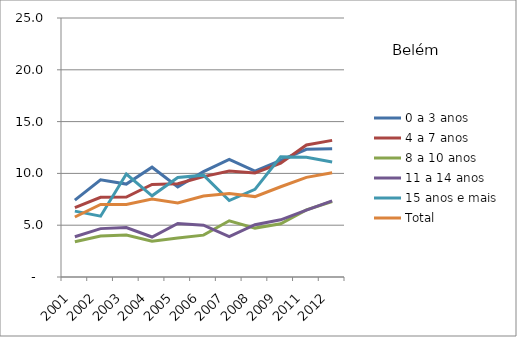
| Category | 0 a 3 anos | 4 a 7 anos | 8 a 10 anos | 11 a 14 anos | 15 anos e mais | Total |
|---|---|---|---|---|---|---|
| 2001.0 | 7.42 | 6.69 | 3.41 | 3.88 | 6.36 | 5.79 |
| 2002.0 | 9.38 | 7.69 | 3.96 | 4.67 | 5.87 | 7.01 |
| 2003.0 | 8.97 | 7.72 | 4.06 | 4.78 | 9.94 | 7.01 |
| 2004.0 | 10.6 | 8.93 | 3.46 | 3.86 | 7.84 | 7.52 |
| 2005.0 | 8.7 | 9.01 | 3.76 | 5.17 | 9.6 | 7.15 |
| 2006.0 | 10.18 | 9.69 | 4.04 | 5 | 9.83 | 7.82 |
| 2007.0 | 11.35 | 10.22 | 5.43 | 3.9 | 7.38 | 8.05 |
| 2008.0 | 10.22 | 10.04 | 4.72 | 5.05 | 8.46 | 7.76 |
| 2009.0 | 11.25 | 10.99 | 5.14 | 5.52 | 11.61 | 8.71 |
| 2011.0 | 12.32 | 12.74 | 6.48 | 6.45 | 11.55 | 9.62 |
| 2012.0 | 12.39 | 13.19 | 7.29 | 7.34 | 11.11 | 10.06 |